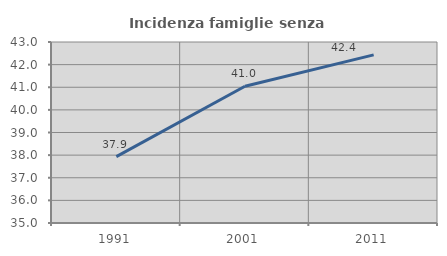
| Category | Incidenza famiglie senza nuclei |
|---|---|
| 1991.0 | 37.931 |
| 2001.0 | 41.045 |
| 2011.0 | 42.43 |